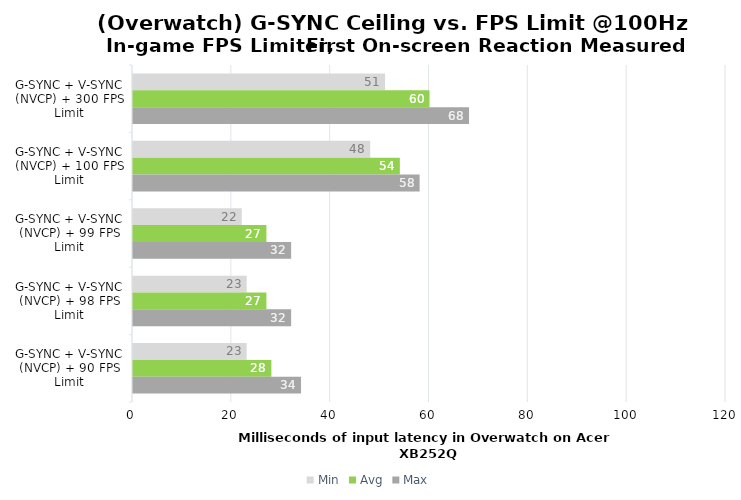
| Category | Min | Avg | Max |
|---|---|---|---|
| G-SYNC + V-SYNC (NVCP) + 300 FPS Limit | 51 | 60 | 68 |
| G-SYNC + V-SYNC (NVCP) + 100 FPS Limit | 48 | 54 | 58 |
| G-SYNC + V-SYNC (NVCP) + 99 FPS Limit | 22 | 27 | 32 |
| G-SYNC + V-SYNC (NVCP) + 98 FPS Limit | 23 | 27 | 32 |
| G-SYNC + V-SYNC (NVCP) + 90 FPS Limit | 23 | 28 | 34 |